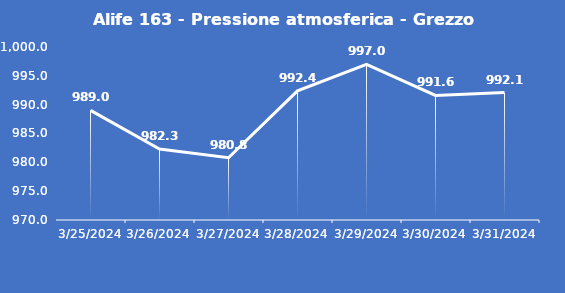
| Category | Alife 163 - Pressione atmosferica - Grezzo (hPa) |
|---|---|
| 3/25/24 | 989 |
| 3/26/24 | 982.3 |
| 3/27/24 | 980.8 |
| 3/28/24 | 992.4 |
| 3/29/24 | 997 |
| 3/30/24 | 991.6 |
| 3/31/24 | 992.1 |